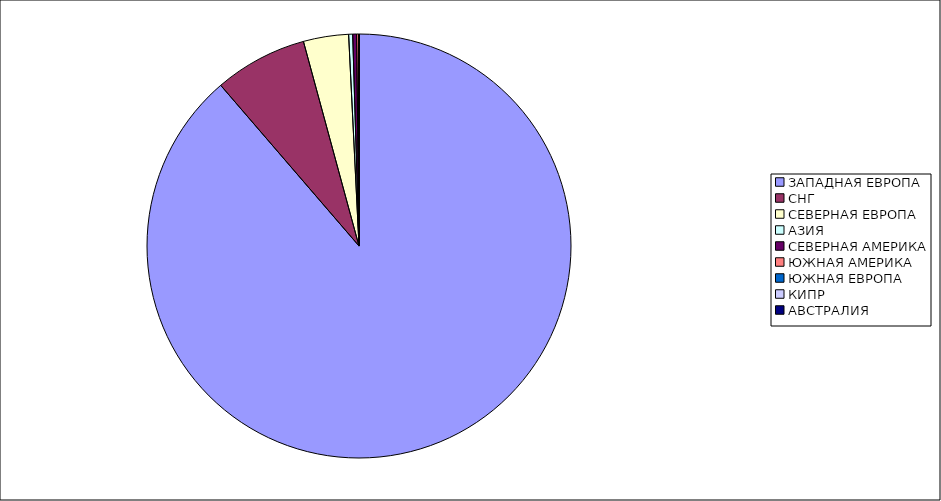
| Category | Оборот |
|---|---|
| ЗАПАДНАЯ ЕВРОПА | 0.887 |
| СНГ | 0.071 |
| СЕВЕРНАЯ ЕВРОПА | 0.034 |
| АЗИЯ | 0.003 |
| СЕВЕРНАЯ АМЕРИКА | 0.003 |
| ЮЖНАЯ АМЕРИКА | 0.002 |
| ЮЖНАЯ ЕВРОПА | 0 |
| КИПР | 0 |
| АВСТРАЛИЯ | 0 |